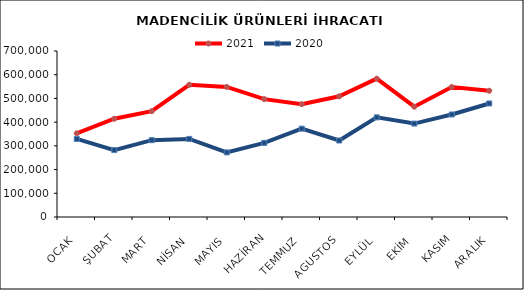
| Category | 2021 | 2020 |
|---|---|---|
| OCAK | 352755.259 | 329222.773 |
| ŞUBAT | 414333.151 | 282226.846 |
| MART | 446331.343 | 323949.137 |
| NİSAN | 557451.146 | 329256.433 |
| MAYIS | 548536.748 | 272368.702 |
| HAZİRAN | 496926.941 | 312612.13 |
| TEMMUZ | 475911.594 | 372489.721 |
| AGUSTOS | 508972.528 | 322478.514 |
| EYLÜL | 583321.285 | 420079.686 |
| EKİM | 465084.559 | 393981.222 |
| KASIM | 548240.196 | 432334.802 |
| ARALIK | 532299.948 | 478794.476 |